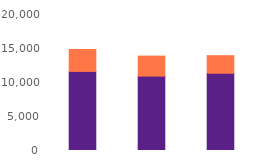
| Category | Online | Telephony |
|---|---|---|
| Jul23 | 11631 | 3224 |
| Aug23 | 10943 | 2938 |
| Sep23 | 11365 | 2579 |